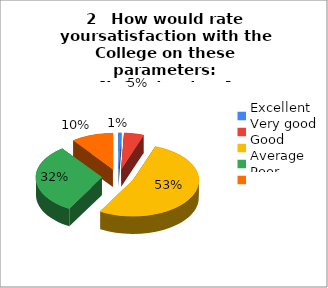
| Category | 2   How would rate
yoursatisfaction with the College on these parameters: [Infrastructure] |
|---|---|
| Excellent | 1 |
| Very good | 7 |
| Good | 77 |
| Average | 46 |
| Poor | 15 |